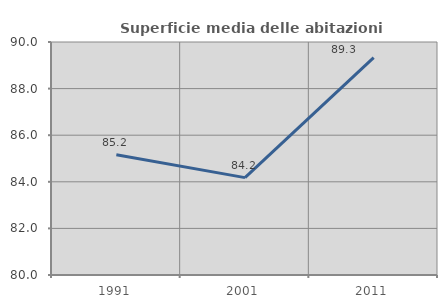
| Category | Superficie media delle abitazioni occupate |
|---|---|
| 1991.0 | 85.159 |
| 2001.0 | 84.179 |
| 2011.0 | 89.33 |